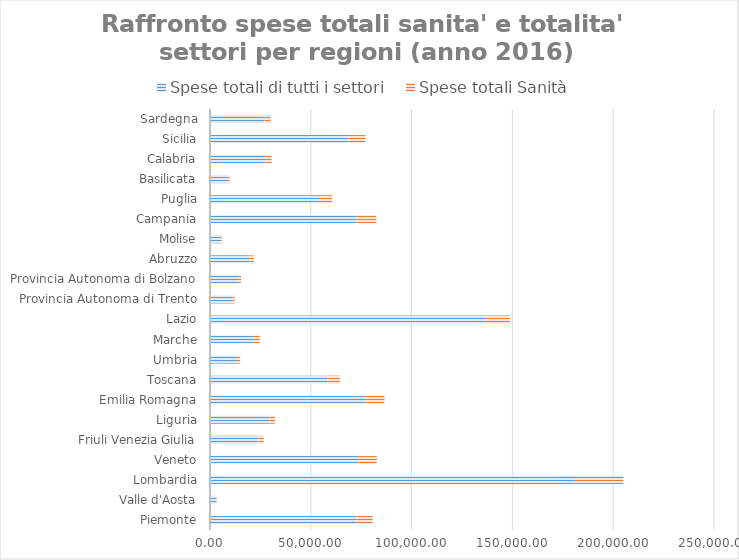
| Category | Spese totali di tutti i settori  | Spese totali Sanità  |
|---|---|---|
| Piemonte | 72590.795 | 8163.102 |
| Valle d'Aosta | 3189.794 | 236.322 |
| Lombardia | 181033.221 | 23999.116 |
| Veneto | 73512.2 | 9228.669 |
| Friuli Venezia Giulia | 24091.463 | 2518.038 |
| Liguria | 29337.891 | 2938.506 |
| Emilia Romagna | 76879.821 | 9654.848 |
| Toscana | 58144.044 | 6301.525 |
| Umbria | 13369.008 | 1593.88 |
| Marche | 21872.255 | 2816.769 |
| Lazio | 136889.465 | 11886.783 |
| Provincia Autonoma di Trento | 11085.231 | 1151.531 |
| Provincia Autonoma di Bolzano | 14309.629 | 1081.838 |
| Abruzzo | 19406.713 | 2358.044 |
| Molise | 5185.429 | 816.082 |
| Campania | 72856.451 | 9677.54 |
| Puglia | 54040.203 | 6604.915 |
| Basilicata | 8773.449 | 975.011 |
| Calabria | 27357.547 | 3188.25 |
| Sicilia | 68860.68 | 8188.166 |
| Sardegna | 27091.85 | 3077.766 |